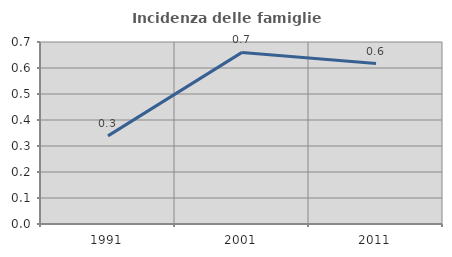
| Category | Incidenza delle famiglie numerose |
|---|---|
| 1991.0 | 0.339 |
| 2001.0 | 0.66 |
| 2011.0 | 0.617 |